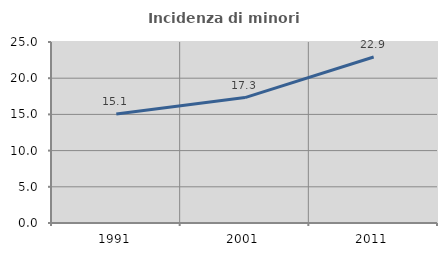
| Category | Incidenza di minori stranieri |
|---|---|
| 1991.0 | 15.068 |
| 2001.0 | 17.325 |
| 2011.0 | 22.921 |